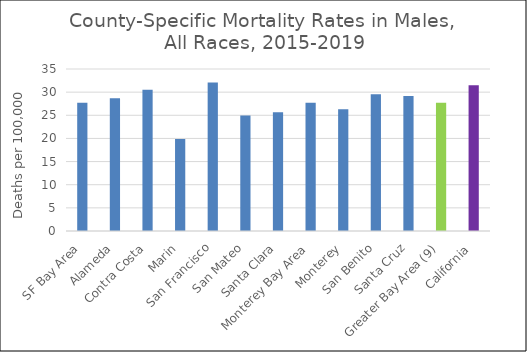
| Category | Male |
|---|---|
| SF Bay Area | 27.7 |
|   Alameda | 28.66 |
|   Contra Costa | 30.54 |
|   Marin | 19.89 |
|   San Francisco | 32.06 |
|   San Mateo | 24.94 |
|   Santa Clara | 25.65 |
| Monterey Bay Area | 27.72 |
|   Monterey | 26.33 |
|   San Benito | 29.52 |
|   Santa Cruz | 29.19 |
| Greater Bay Area (9) | 27.7 |
| California | 31.51 |